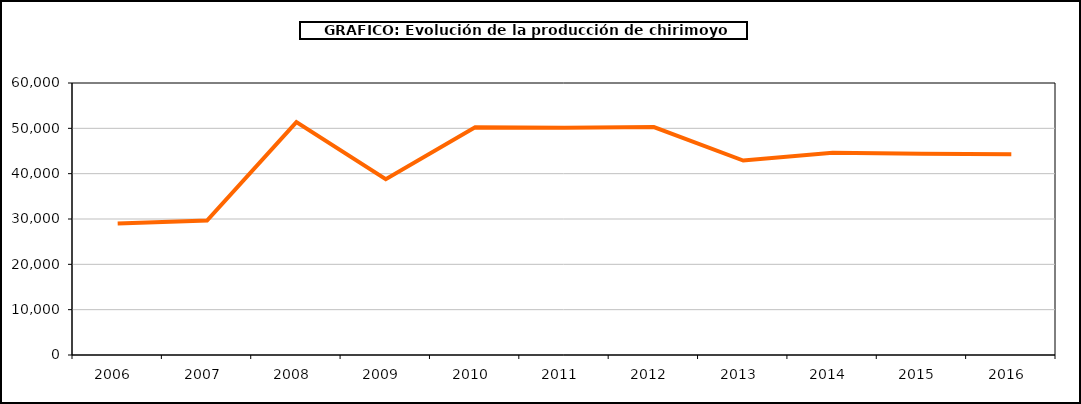
| Category | producción chirimoyo |
|---|---|
| 2006.0 | 29025 |
| 2007.0 | 29671 |
| 2008.0 | 51356 |
| 2009.0 | 38775 |
| 2010.0 | 50241 |
| 2011.0 | 50150 |
| 2012.0 | 50285 |
| 2013.0 | 42898 |
| 2014.0 | 44629 |
| 2015.0 | 44389 |
| 2016.0 | 44305 |